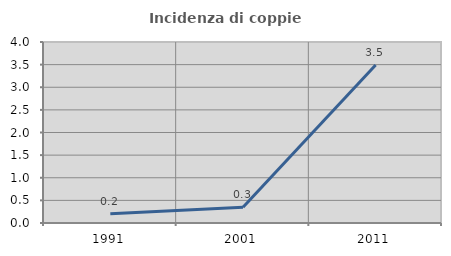
| Category | Incidenza di coppie miste |
|---|---|
| 1991.0 | 0.202 |
| 2001.0 | 0.35 |
| 2011.0 | 3.49 |